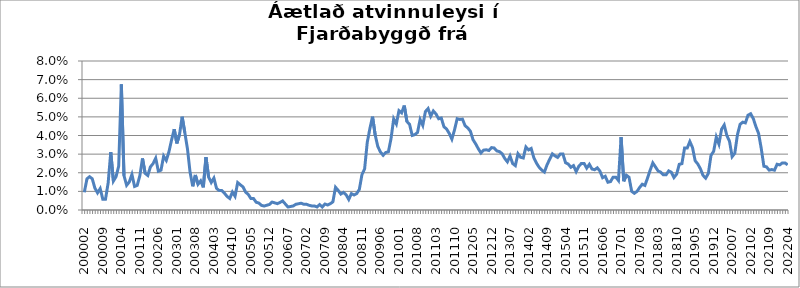
| Category | Series 0 |
|---|---|
| 200002 | 0.009 |
| 200003 | 0.017 |
| 200004 | 0.018 |
| 200005 | 0.017 |
| 200006 | 0.012 |
| 200007 | 0.009 |
| 200008 | 0.012 |
| 200009 | 0.006 |
| 200010 | 0.006 |
| 200011 | 0.014 |
| 200012 | 0.031 |
| 200101 | 0.016 |
| 200102 | 0.018 |
| 200103 | 0.024 |
| 200104 | 0.067 |
| 200105 | 0.018 |
| 200106 | 0.013 |
| 200107 | 0.015 |
| 200108 | 0.019 |
| 200109 | 0.013 |
| 200110 | 0.013 |
| 200111 | 0.018 |
| 200112 | 0.028 |
| 200201 | 0.02 |
| 200202 | 0.019 |
| 200203 | 0.023 |
| 200204 | 0.025 |
| 200205 | 0.028 |
| 200206 | 0.021 |
| 200207 | 0.021 |
| 200208 | 0.029 |
| 200209 | 0.027 |
| 200210 | 0.031 |
| 200211 | 0.038 |
| 200212 | 0.043 |
| 200301 | 0.036 |
| 200302 | 0.041 |
| 200303 | 0.05 |
| 200304 | 0.042 |
| 200305 | 0.033 |
| 200306 | 0.02 |
| 200307 | 0.013 |
| 200308 | 0.019 |
| 200309 | 0.014 |
| 200310 | 0.016 |
| 200311 | 0.012 |
| 200312 | 0.028 |
| 200401 | 0.018 |
| 200402 | 0.015 |
| 200403 | 0.017 |
| 200404 | 0.012 |
| 200405 | 0.01 |
| 200406 | 0.01 |
| 200407 | 0.009 |
| 200408 | 0.007 |
| 200409 | 0.006 |
| 200410 | 0.01 |
| 200411 | 0.007 |
| 200412 | 0.015 |
| 200501 | 0.014 |
| 200502 | 0.012 |
| 200503 | 0.01 |
| 200504 | 0.008 |
| 200505 | 0.006 |
| 200506 | 0.006 |
| 200507 | 0.004 |
| 200508 | 0.004 |
| 200509 | 0.002 |
| 200510 | 0.002 |
| 200511 | 0.003 |
| 200512 | 0.003 |
| 200601 | 0.004 |
| 200602 | 0.004 |
| 200603 | 0.003 |
| 200604 | 0.004 |
| 200605 | 0.005 |
| 200606 | 0.003 |
| 200607 | 0.002 |
| 200608 | 0.002 |
| 200609 | 0.002 |
| 200610 | 0.003 |
| 200611 | 0.003 |
| 200612 | 0.004 |
| 200701 | 0.003 |
| 200702 | 0.003 |
| 200703 | 0.003 |
| 200704 | 0.002 |
| 200705 | 0.002 |
| 200706 | 0.002 |
| 200707 | 0.003 |
| 200708 | 0.002 |
| 200709 | 0.003 |
| 200710 | 0.003 |
| 200711 | 0.003 |
| 200712 | 0.004 |
| 200801 | 0.012 |
| 200802 | 0.011 |
| 200803 | 0.009 |
| 200804 | 0.009 |
| 200805 | 0.008 |
| 200806 | 0.006 |
| 200807 | 0.009 |
| 200808 | 0.008 |
| 200809 | 0.009 |
| 200810 | 0.011 |
| 200811 | 0.019 |
| 200812 | 0.022 |
| 200901 | 0.036 |
| 200902 | 0.044 |
| 200903 | 0.05 |
| 200904 | 0.04 |
| 200905 | 0.034 |
| 200906 | 0.031 |
| 200907 | 0.029 |
| 200908 | 0.031 |
| 200909 | 0.031 |
| 200910 | 0.038 |
| 200911 | 0.049 |
| 200912 | 0.046 |
| 201001 | 0.053 |
| 201002 | 0.052 |
| 201003 | 0.056 |
| 201004 | 0.048 |
| 201005 | 0.046 |
| 201006 | 0.04 |
| 201007 | 0.04 |
| 201008 | 0.042 |
| 201009 | 0.049 |
| 201010 | 0.045 |
| 201011 | 0.053 |
| 201012 | 0.054 |
| 201101 | 0.05 |
| 201102 | 0.053 |
| 201103 | 0.052 |
| 201104 | 0.049 |
| 201105 | 0.049 |
| 201106 | 0.045 |
| 201107 | 0.043 |
| 201108 | 0.041 |
| 201109 | 0.038 |
| 201110 | 0.043 |
| 201111 | 0.049 |
| 201112 | 0.049 |
| 201201 | 0.049 |
| 201202 | 0.045 |
| 201203 | 0.044 |
| 201204 | 0.042 |
| 201205 | 0.038 |
| 201206 | 0.036 |
| 201207 | 0.033 |
| 201208 | 0.031 |
| 201209 | 0.032 |
| 201210 | 0.032 |
| 201211 | 0.032 |
| 201212 | 0.034 |
| 201301 | 0.033 |
| 201302 | 0.032 |
| 201303 | 0.031 |
| 201304 | 0.03 |
| 201305 | 0.028 |
| 201306 | 0.026 |
| 201307 | 0.029 |
| 201308 | 0.025 |
| 201309 | 0.024 |
| 201310 | 0.03 |
| 201311 | 0.028 |
| 201312 | 0.028 |
| 201401 | 0.034 |
| 201402 | 0.032 |
| 201403 | 0.033 |
| 201404 | 0.028 |
| 201405 | 0.025 |
| 201406 | 0.023 |
| 201407 | 0.021 |
| 201408 | 0.02 |
| 201409 | 0.024 |
| 201410 | 0.027 |
| 201411 | 0.03 |
| 201412 | 0.029 |
| 201501 | 0.028 |
| 201502 | 0.03 |
| 201503 | 0.03 |
| 201504 | 0.025 |
| 201505 | 0.025 |
| 201506 | 0.023 |
| 201507 | 0.024 |
| 201508 | 0.021 |
| 201509 | 0.023 |
| 201510 | 0.025 |
| 201511 | 0.025 |
| 201512 | 0.022 |
| 201601 | 0.025 |
| 201602 | 0.022 |
| 201603 | 0.022 |
| 201604 | 0.023 |
| 201605 | 0.021 |
| 201606 | 0.017 |
| 201607 | 0.018 |
| 201608 | 0.015 |
| 201609 | 0.015 |
| 201610 | 0.018 |
| 201611 | 0.018 |
| 201612 | 0.016 |
| 201701 | 0.039 |
| 201702 | 0.015 |
| 201703 | 0.019 |
| 201704 | 0.018 |
| 201705 | 0.01 |
| 201706 | 0.009 |
| 201707 | 0.01 |
| 201708 | 0.012 |
| 201709 | 0.014 |
| 201710 | 0.013 |
| 201711 | 0.017 |
| 201712 | 0.021 |
| 201801 | 0.025 |
| 201802 | 0.023 |
| 201803 | 0.021 |
| 201804 | 0.02 |
| 201805 | 0.019 |
| 201806 | 0.019 |
| 201807 | 0.021 |
| 201808 | 0.02 |
| 201809 | 0.017 |
| 201810 | 0.019 |
| 201811 | 0.025 |
| 201812 | 0.025 |
| 201901 | 0.033 |
| 201902 | 0.033 |
| 201903 | 0.037 |
| 201904 | 0.034 |
| 201905 | 0.026 |
| 201906 | 0.025 |
| 201907 | 0.022 |
| 201908 | 0.019 |
| 201909 | 0.017 |
| 201910 | 0.02 |
| 201911 | 0.029 |
| 201912 | 0.031 |
| 202001 | 0.039 |
| 202002 | 0.035 |
| 202003*** | 0.043 |
| 202004 | 0.046 |
| 202005 | 0.04 |
| 202006 | 0.037 |
| 202007 | 0.029 |
| 202008 | 0.03 |
| 202009 | 0.04 |
| 202010 | 0.046 |
| 202011 | 0.047 |
| 202012 | 0.047 |
| 202101 | 0.051 |
| 202102 | 0.052 |
| 202103 | 0.049 |
| 202104 | 0.045 |
| 202105 | 0.041 |
| 202106 | 0.033 |
| 202107 | 0.024 |
| 202108 | 0.023 |
| 202109 | 0.021 |
| 202110 | 0.022 |
| 202111 | 0.021 |
| 202112 | 0.025 |
| 202201 | 0.024 |
| 202202 | 0.025 |
| 202203 | 0.025 |
| 202204 | 0.024 |